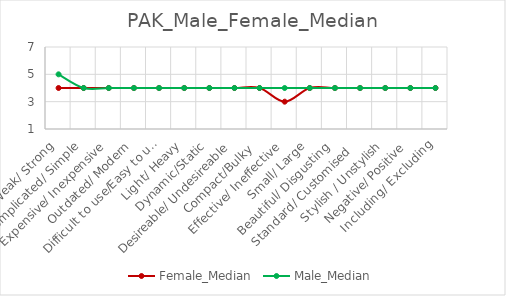
| Category | Female_Median | Male_Median |
|---|---|---|
| Weak/ Strong | 4 | 5 |
| Complicated/ Simple | 4 | 4 |
| Expensive/ Inexpensive | 4 | 4 |
| Outdated/ Modern | 4 | 4 |
| Difficult to use/Easy to use | 4 | 4 |
| Light/ Heavy | 4 | 4 |
| Dynamic/Static | 4 | 4 |
| Desireable/ Undesireable | 4 | 4 |
| Compact/Bulky  | 4 | 4 |
| Effective/ Ineffective | 3 | 4 |
| Small/ Large | 4 | 4 |
| Beautiful/ Disgusting | 4 | 4 |
| Standard/ Customised   | 4 | 4 |
| Stylish / Unstylish | 4 | 4 |
| Negative/ Positive | 4 | 4 |
| Including/ Excluding | 4 | 4 |